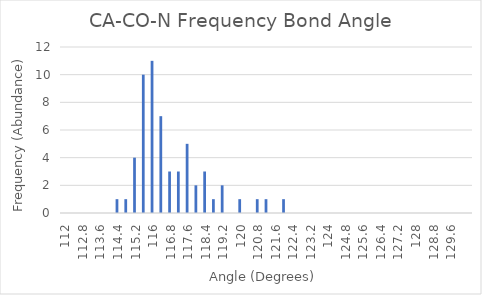
| Category | Series 0 |
|---|---|
| 112.0 | 0 |
| 112.4 | 0 |
| 112.80000000000001 | 0 |
| 113.20000000000002 | 0 |
| 113.60000000000002 | 0 |
| 114.00000000000003 | 0 |
| 114.40000000000003 | 1 |
| 114.80000000000004 | 1 |
| 115.20000000000005 | 4 |
| 115.60000000000005 | 10 |
| 116.00000000000006 | 11 |
| 116.40000000000006 | 7 |
| 116.80000000000007 | 3 |
| 117.20000000000007 | 3 |
| 117.60000000000008 | 5 |
| 118.00000000000009 | 2 |
| 118.40000000000009 | 3 |
| 118.8000000000001 | 1 |
| 119.2000000000001 | 2 |
| 119.60000000000011 | 0 |
| 120.00000000000011 | 1 |
| 120.40000000000012 | 0 |
| 120.80000000000013 | 1 |
| 121.20000000000013 | 1 |
| 121.60000000000014 | 0 |
| 122.00000000000014 | 1 |
| 122.40000000000015 | 0 |
| 122.80000000000015 | 0 |
| 123.20000000000016 | 0 |
| 123.60000000000016 | 0 |
| 124.00000000000017 | 0 |
| 124.40000000000018 | 0 |
| 124.80000000000018 | 0 |
| 125.20000000000019 | 0 |
| 125.6000000000002 | 0 |
| 126.0000000000002 | 0 |
| 126.4000000000002 | 0 |
| 126.80000000000021 | 0 |
| 127.20000000000022 | 0 |
| 127.60000000000022 | 0 |
| 128.00000000000023 | 0 |
| 128.40000000000023 | 0 |
| 128.80000000000024 | 0 |
| 129.20000000000024 | 0 |
| 129.60000000000025 | 0 |
| 130.00000000000026 | 0 |